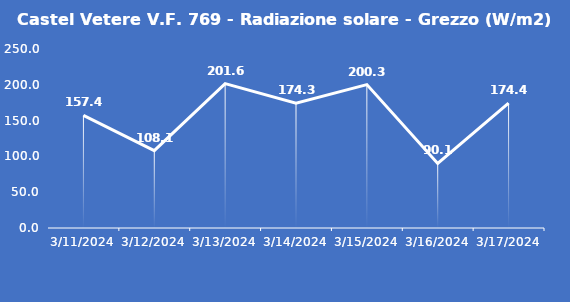
| Category | Castel Vetere V.F. 769 - Radiazione solare - Grezzo (W/m2) |
|---|---|
| 3/11/24 | 157.4 |
| 3/12/24 | 108.1 |
| 3/13/24 | 201.6 |
| 3/14/24 | 174.3 |
| 3/15/24 | 200.3 |
| 3/16/24 | 90.1 |
| 3/17/24 | 174.4 |